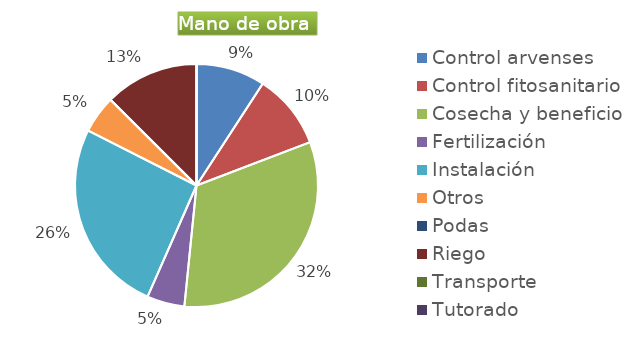
| Category | Series 0 |
|---|---|
| Control arvenses | 624877 |
| Control fitosanitario | 681684 |
| Cosecha y beneficio | 2205000 |
| Fertilización | 340842 |
| Instalación | 1761017 |
| Otros | 340842 |
| Podas | 0 |
| Riego | 852105 |
| Transporte | 0 |
| Tutorado | 0 |